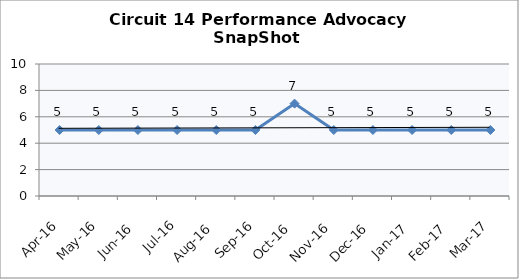
| Category | Circuit 14 |
|---|---|
| Apr-16 | 5 |
| May-16 | 5 |
| Jun-16 | 5 |
| Jul-16 | 5 |
| Aug-16 | 5 |
| Sep-16 | 5 |
| Oct-16 | 7 |
| Nov-16 | 5 |
| Dec-16 | 5 |
| Jan-17 | 5 |
| Feb-17 | 5 |
| Mar-17 | 5 |